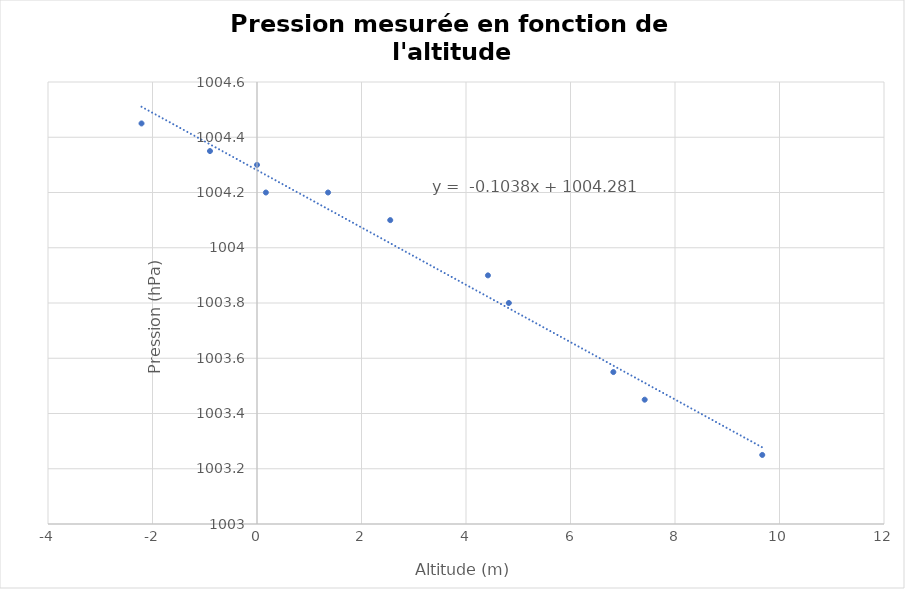
| Category | z (m) |
|---|---|
| -2.21 | 1004.45 |
| -0.9 | 1004.35 |
| 0.0 | 1004.3 |
| 0.17 | 1004.2 |
| 1.36 | 1004.2 |
| 2.5500000000000003 | 1004.1 |
| 4.42 | 1003.9 |
| 4.82 | 1003.8 |
| 6.82 | 1003.55 |
| 7.42 | 1003.45 |
| 9.67 | 1003.25 |